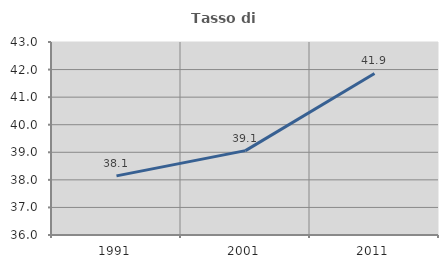
| Category | Tasso di occupazione   |
|---|---|
| 1991.0 | 38.144 |
| 2001.0 | 39.06 |
| 2011.0 | 41.86 |